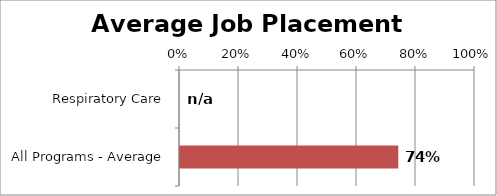
| Category | Series 0 |
|---|---|
| Respiratory Care | 0 |
| All Programs - Average | 0.74 |